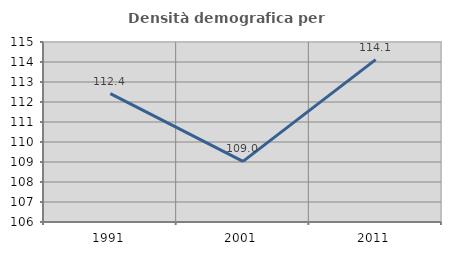
| Category | Densità demografica |
|---|---|
| 1991.0 | 112.423 |
| 2001.0 | 109.03 |
| 2011.0 | 114.119 |